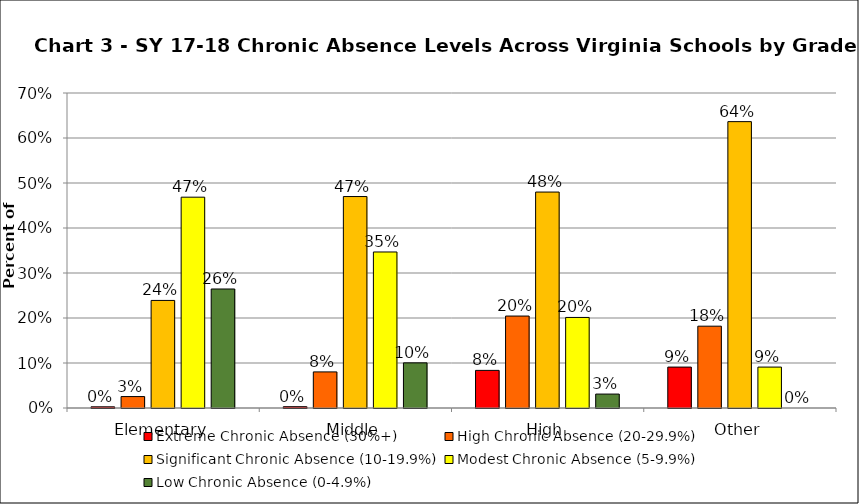
| Category | Extreme Chronic Absence (30%+) | High Chronic Absence (20-29.9%) | Significant Chronic Absence (10-19.9%) | Modest Chronic Absence (5-9.9%) | Low Chronic Absence (0-4.9%) |
|---|---|---|---|---|---|
| 0 | 0.003 | 0.025 | 0.239 | 0.468 | 0.264 |
| 1 | 0.003 | 0.08 | 0.47 | 0.347 | 0.1 |
| 2 | 0.084 | 0.204 | 0.48 | 0.201 | 0.031 |
| 3 | 0.091 | 0.182 | 0.636 | 0.091 | 0 |